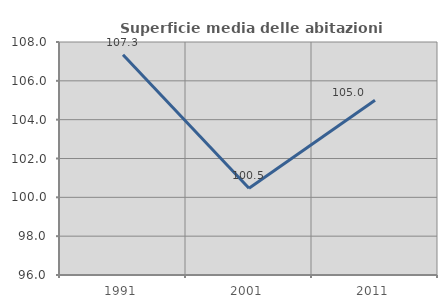
| Category | Superficie media delle abitazioni occupate |
|---|---|
| 1991.0 | 107.343 |
| 2001.0 | 100.463 |
| 2011.0 | 105.002 |